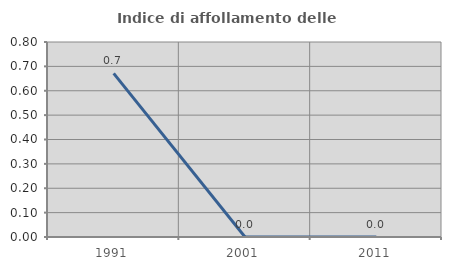
| Category | Indice di affollamento delle abitazioni  |
|---|---|
| 1991.0 | 0.671 |
| 2001.0 | 0 |
| 2011.0 | 0 |